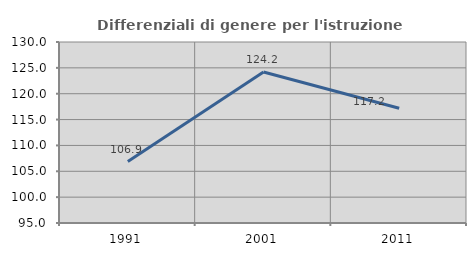
| Category | Differenziali di genere per l'istruzione superiore |
|---|---|
| 1991.0 | 106.89 |
| 2001.0 | 124.188 |
| 2011.0 | 117.196 |